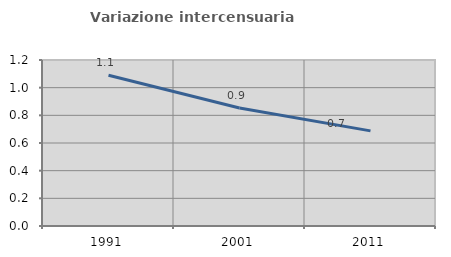
| Category | Variazione intercensuaria annua |
|---|---|
| 1991.0 | 1.09 |
| 2001.0 | 0.853 |
| 2011.0 | 0.688 |